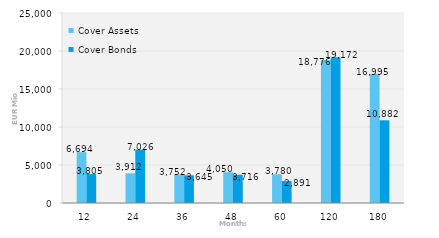
| Category | Cover Assets | Cover Bonds |
|---|---|---|
| 12.0 | 6693.951 | 3805.342 |
| 24.0 | 3911.986 | 7026.144 |
| 36.0 | 3751.834 | 3644.688 |
| 48.0 | 4049.533 | 3716 |
| 60.0 | 3779.517 | 2890.872 |
| 120.0 | 18775.616 | 19172.178 |
| 180.0 | 16995.012 | 10882.241 |